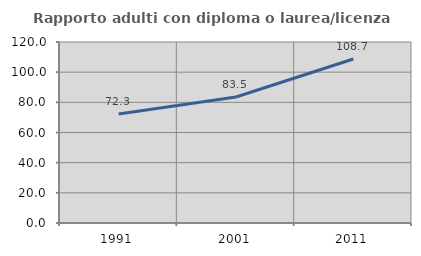
| Category | Rapporto adulti con diploma o laurea/licenza media  |
|---|---|
| 1991.0 | 72.26 |
| 2001.0 | 83.519 |
| 2011.0 | 108.705 |